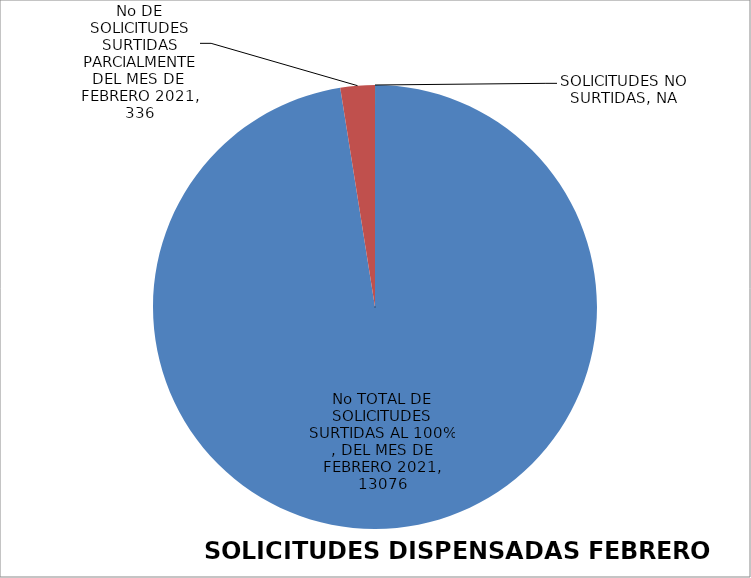
| Category | Series 0 |
|---|---|
| No TOTAL DE SOLICITUDES SURTIDAS AL 100% , DEL MES DE FEBRERO 2021 | 13076 |
| No DE SOLICITUDES SURTIDAS PARCIALMENTE DEL MES DE  FEBRERO 2021 | 336 |
| SOLICITUDES NO SURTIDAS | 0 |